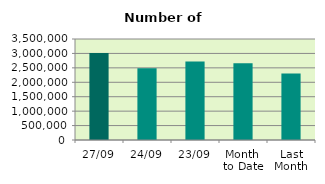
| Category | Series 0 |
|---|---|
| 27/09 | 3014674 |
| 24/09 | 2484554 |
| 23/09 | 2723544 |
| Month 
to Date | 2663381.263 |
| Last
Month | 2303894.727 |